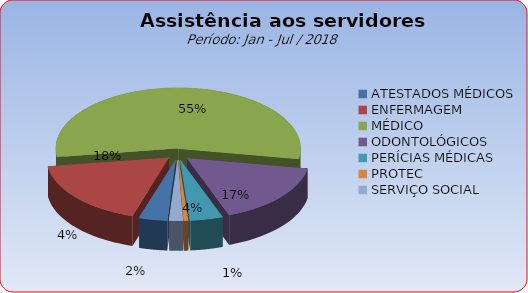
| Category | Series 0 |
|---|---|
| ATESTADOS MÉDICOS | 3.72 |
| ENFERMAGEM | 17.897 |
| MÉDICO | 55.017 |
| ODONTOLÓGICOS | 16.657 |
| PERÍCIAS MÉDICAS | 4.34 |
| PROTEC | 0.564 |
| SERVIÇO SOCIAL | 1.804 |